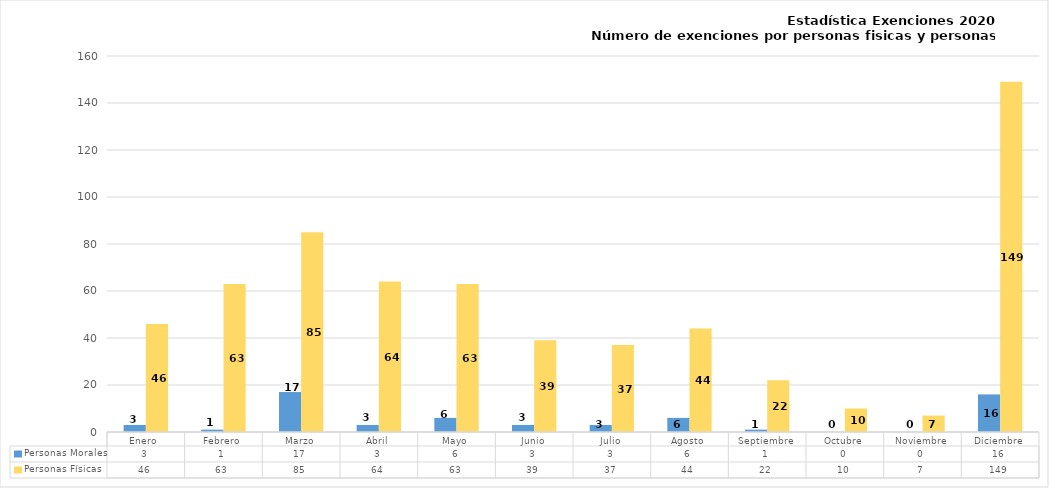
| Category | Personas Morales | Personas Físicas |
|---|---|---|
| Enero  | 3 | 46 |
| Febrero | 1 | 63 |
| Marzo | 17 | 85 |
| Abril | 3 | 64 |
| Mayo | 6 | 63 |
| Junio | 3 | 39 |
| Julio | 3 | 37 |
| Agosto | 6 | 44 |
| Septiembre | 1 | 22 |
| Octubre | 0 | 10 |
| Noviembre | 0 | 7 |
| Diciembre | 16 | 149 |